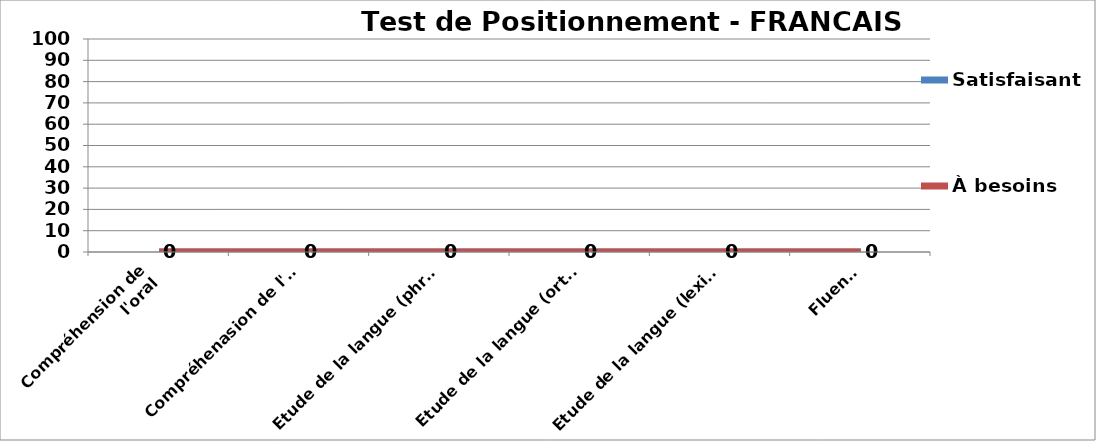
| Category | Satisfaisant | À besoins |
|---|---|---|
| Compréhension de l'oral
 | 0 | 0 |
| Compréhenasion de l'écrit | 0 | 0 |
| Etude de la langue (phrase, composition) | 0 | 0 |
| Etude de la langue (orthographe) | 0 | 0 |
| Etude de la langue (lexique) | 0 | 0 |
| Fluence | 0 | 0 |